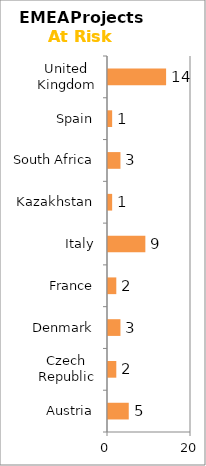
| Category | Total |
|---|---|
| Austria | 5 |
| Czech Republic | 2 |
| Denmark | 3 |
| France | 2 |
| Italy | 9 |
| Kazakhstan | 1 |
| South Africa | 3 |
| Spain | 1 |
| United Kingdom | 14 |